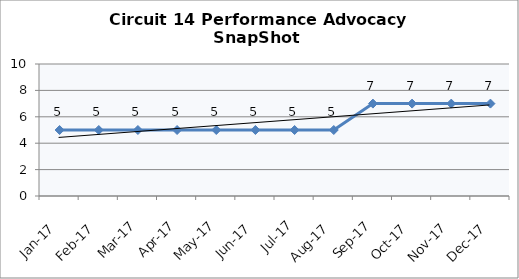
| Category | Circuit 14 |
|---|---|
| Jan-17 | 5 |
| Feb-17 | 5 |
| Mar-17 | 5 |
| Apr-17 | 5 |
| May-17 | 5 |
| Jun-17 | 5 |
| Jul-17 | 5 |
| Aug-17 | 5 |
| Sep-17 | 7 |
| Oct-17 | 7 |
| Nov-17 | 7 |
| Dec-17 | 7 |